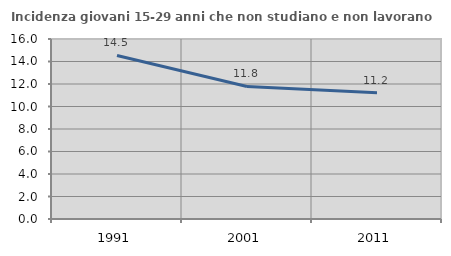
| Category | Incidenza giovani 15-29 anni che non studiano e non lavorano  |
|---|---|
| 1991.0 | 14.54 |
| 2001.0 | 11.785 |
| 2011.0 | 11.231 |